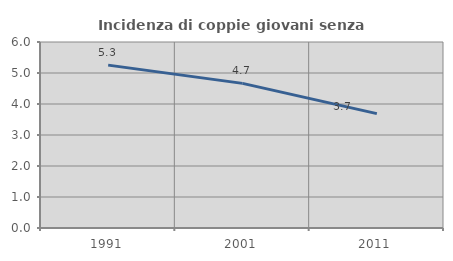
| Category | Incidenza di coppie giovani senza figli |
|---|---|
| 1991.0 | 5.254 |
| 2001.0 | 4.665 |
| 2011.0 | 3.689 |